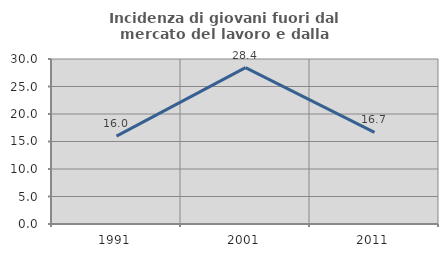
| Category | Incidenza di giovani fuori dal mercato del lavoro e dalla formazione  |
|---|---|
| 1991.0 | 15.976 |
| 2001.0 | 28.44 |
| 2011.0 | 16.667 |